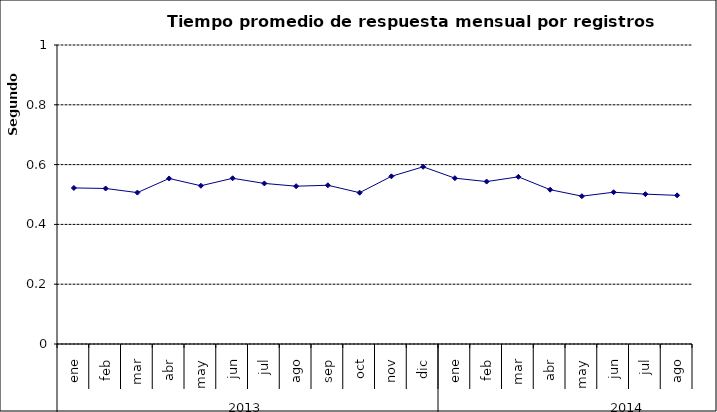
| Category | Tiempo promedio de respuesta por registros cámara PH ** |
|---|---|
| 0 | 0.522 |
| 1 | 0.52 |
| 2 | 0.506 |
| 3 | 0.554 |
| 4 | 0.529 |
| 5 | 0.554 |
| 6 | 0.537 |
| 7 | 0.528 |
| 8 | 0.531 |
| 9 | 0.506 |
| 10 | 0.561 |
| 11 | 0.593 |
| 12 | 0.555 |
| 13 | 0.543 |
| 14 | 0.559 |
| 15 | 0.516 |
| 16 | 0.494 |
| 17 | 0.508 |
| 18 | 0.501 |
| 19 | 0.497 |